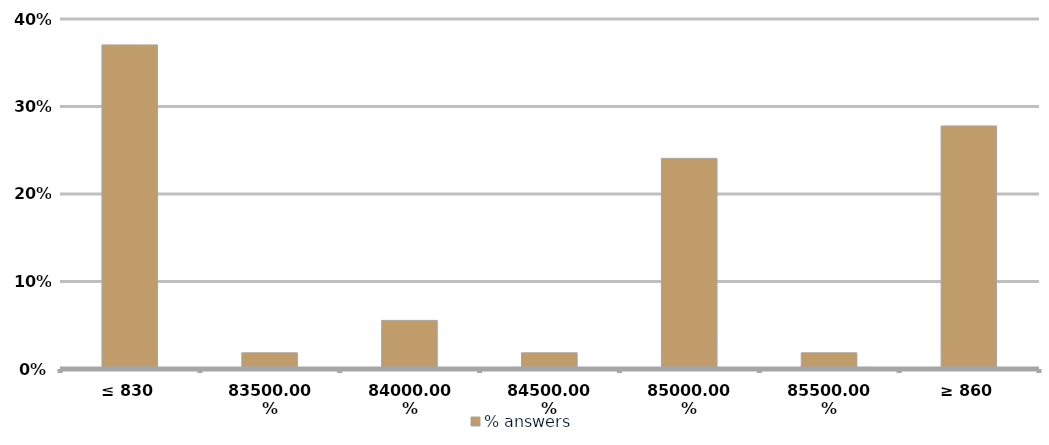
| Category | % answers |
|---|---|
| ≤ 830 | 0.37 |
| 835 | 0.019 |
| 840 | 0.056 |
| 845 | 0.019 |
| 850 | 0.241 |
| 855 | 0.019 |
| ≥ 860 | 0.278 |